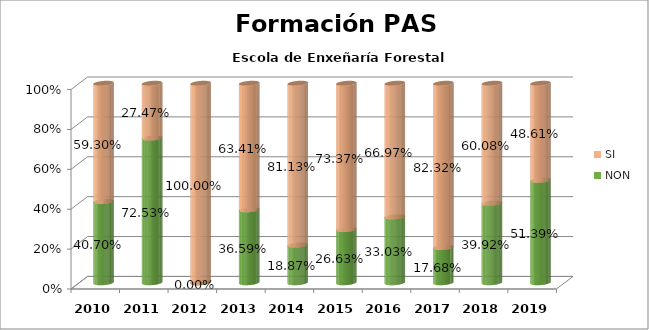
| Category | NON | SI |
|---|---|---|
| 2010.0 | 0.407 | 0.593 |
| 2011.0 | 0.725 | 0.275 |
| 2012.0 | 0 | 1 |
| 2013.0 | 0.366 | 0.634 |
| 2014.0 | 0.189 | 0.811 |
| 2015.0 | 0.266 | 0.734 |
| 2016.0 | 0.33 | 0.67 |
| 2017.0 | 0.177 | 0.823 |
| 2018.0 | 0.399 | 0.601 |
| 2019.0 | 0.514 | 0.486 |